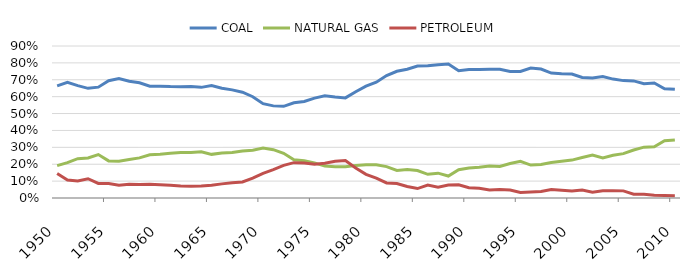
| Category | COAL | NATURAL GAS | PETROLEUM |
|---|---|---|---|
| 1950.0 | 0.664 | 0.191 | 0.145 |
| 1951.0 | 0.685 | 0.209 | 0.106 |
| 1952.0 | 0.666 | 0.233 | 0.101 |
| 1953.0 | 0.649 | 0.237 | 0.114 |
| 1954.0 | 0.656 | 0.257 | 0.087 |
| 1955.0 | 0.695 | 0.22 | 0.086 |
| 1956.0 | 0.707 | 0.217 | 0.075 |
| 1957.0 | 0.691 | 0.228 | 0.081 |
| 1958.0 | 0.683 | 0.237 | 0.08 |
| 1959.0 | 0.662 | 0.256 | 0.082 |
| 1960.0 | 0.662 | 0.259 | 0.079 |
| 1961.0 | 0.66 | 0.265 | 0.076 |
| 1962.0 | 0.659 | 0.27 | 0.072 |
| 1963.0 | 0.661 | 0.27 | 0.07 |
| 1964.0 | 0.655 | 0.274 | 0.071 |
| 1965.0 | 0.666 | 0.258 | 0.076 |
| 1966.0 | 0.65 | 0.266 | 0.084 |
| 1967.0 | 0.64 | 0.269 | 0.091 |
| 1968.0 | 0.626 | 0.278 | 0.095 |
| 1969.0 | 0.6 | 0.283 | 0.117 |
| 1970.0 | 0.558 | 0.296 | 0.146 |
| 1971.0 | 0.545 | 0.286 | 0.168 |
| 1972.0 | 0.543 | 0.264 | 0.193 |
| 1973.0 | 0.564 | 0.227 | 0.209 |
| 1974.0 | 0.572 | 0.221 | 0.208 |
| 1975.0 | 0.592 | 0.208 | 0.201 |
| 1976.0 | 0.606 | 0.189 | 0.205 |
| 1977.0 | 0.597 | 0.185 | 0.217 |
| 1978.0 | 0.593 | 0.186 | 0.222 |
| 1979.0 | 0.629 | 0.193 | 0.178 |
| 1980.0 | 0.662 | 0.197 | 0.14 |
| 1981.0 | 0.685 | 0.197 | 0.118 |
| 1982.0 | 0.725 | 0.186 | 0.089 |
| 1983.0 | 0.751 | 0.163 | 0.086 |
| 1984.0 | 0.763 | 0.169 | 0.068 |
| 1985.0 | 0.781 | 0.163 | 0.056 |
| 1986.0 | 0.783 | 0.14 | 0.077 |
| 1987.0 | 0.789 | 0.147 | 0.064 |
| 1988.0 | 0.793 | 0.13 | 0.077 |
| 1989.0 | 0.754 | 0.168 | 0.078 |
| 1990.0 | 0.762 | 0.178 | 0.06 |
| 1991.0 | 0.76 | 0.182 | 0.057 |
| 1992.0 | 0.763 | 0.19 | 0.047 |
| 1993.0 | 0.762 | 0.187 | 0.051 |
| 1994.0 | 0.749 | 0.204 | 0.047 |
| 1995.0 | 0.75 | 0.218 | 0.033 |
| 1996.0 | 0.77 | 0.195 | 0.035 |
| 1997.0 | 0.763 | 0.198 | 0.038 |
| 1998.0 | 0.739 | 0.21 | 0.051 |
| 1999.0 | 0.736 | 0.218 | 0.046 |
| 2000.0 | 0.734 | 0.224 | 0.042 |
| 2001.0 | 0.714 | 0.24 | 0.047 |
| 2002.0 | 0.711 | 0.254 | 0.035 |
| 2003.0 | 0.72 | 0.237 | 0.044 |
| 2004.0 | 0.704 | 0.253 | 0.043 |
| 2005.0 | 0.695 | 0.263 | 0.042 |
| 2006.0 | 0.693 | 0.284 | 0.022 |
| 2007.0 | 0.677 | 0.301 | 0.022 |
| 2008.0 | 0.681 | 0.303 | 0.016 |
| 2009.0 | 0.647 | 0.339 | 0.014 |
| 2010.0 | 0.643 | 0.344 | 0.013 |